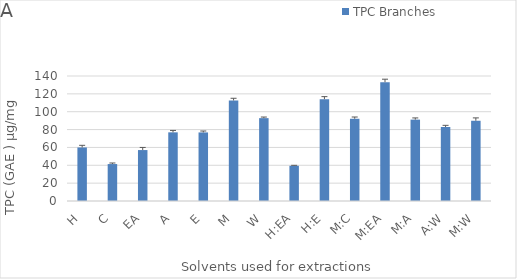
| Category | TPC Branches  |
|---|---|
| H | 59.954 |
| C | 41.375 |
| EA | 57.047 |
| A | 76.9 |
| E | 76.791 |
| M | 112.605 |
| W | 92.798 |
| H:EA | 39.453 |
| H:E | 114.062 |
| M:C | 92.093 |
| M:EA | 133.064 |
| M:A | 91.148 |
| A:W | 82.861 |
| M:W | 89.869 |